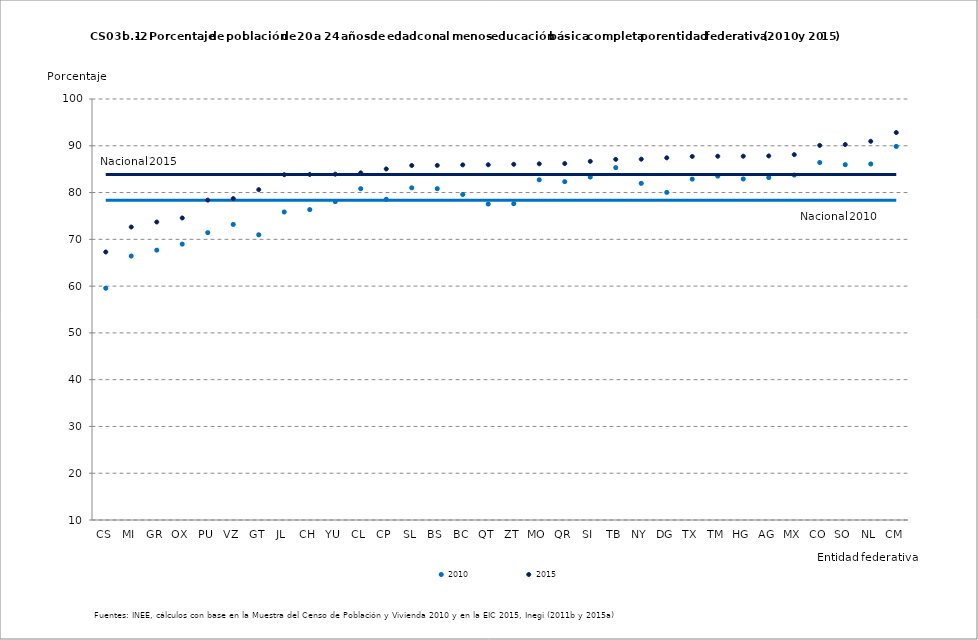
| Category | 2010 | nal2010 | 2015 | nal2015 |
|---|---|---|---|---|
| CS | 59.549 | 78.334 | 67.296 | 83.87 |
| MI | 66.434 | 78.334 | 72.634 | 83.87 |
| GR | 67.687 | 78.334 | 73.704 | 83.87 |
| OX | 68.973 | 78.334 | 74.565 | 83.87 |
| PU | 71.438 | 78.334 | 78.383 | 83.87 |
| VZ | 73.186 | 78.334 | 78.717 | 83.87 |
| GT | 70.972 | 78.334 | 80.623 | 83.87 |
| JL | 75.85 | 78.334 | 83.814 | 83.87 |
| CH | 76.361 | 78.334 | 83.873 | 83.87 |
| YU | 78.06 | 78.334 | 83.933 | 83.87 |
| CL | 80.823 | 78.334 | 84.205 | 83.87 |
| CP | 78.554 | 78.334 | 85.045 | 83.87 |
| SL | 81.013 | 78.334 | 85.791 | 83.87 |
| BS | 80.826 | 78.334 | 85.806 | 83.87 |
| BC | 79.585 | 78.334 | 85.917 | 83.87 |
| QT | 77.546 | 78.334 | 85.941 | 83.87 |
| ZT | 77.617 | 78.334 | 86.047 | 83.87 |
| MO | 82.727 | 78.334 | 86.142 | 83.87 |
| QR | 82.329 | 78.334 | 86.201 | 83.87 |
| SI | 83.314 | 78.334 | 86.677 | 83.87 |
| TB | 85.331 | 78.334 | 87.101 | 83.87 |
| NY | 81.971 | 78.334 | 87.137 | 83.87 |
| DG | 80.038 | 78.334 | 87.426 | 83.87 |
| TX | 82.874 | 78.334 | 87.72 | 83.87 |
| TM | 83.51 | 78.334 | 87.764 | 83.87 |
| HG | 82.903 | 78.334 | 87.767 | 83.87 |
| AG | 83.2 | 78.334 | 87.831 | 83.87 |
| MX | 83.734 | 78.334 | 88.108 | 83.87 |
| CO | 86.422 | 78.334 | 90.08 | 83.87 |
| SO | 85.956 | 78.334 | 90.266 | 83.87 |
| NL | 86.108 | 78.334 | 90.962 | 83.87 |
| CM | 89.858 | 78.334 | 92.831 | 83.87 |